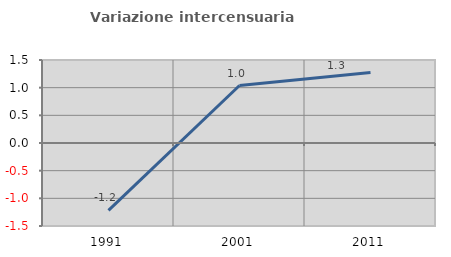
| Category | Variazione intercensuaria annua |
|---|---|
| 1991.0 | -1.218 |
| 2001.0 | 1.039 |
| 2011.0 | 1.276 |